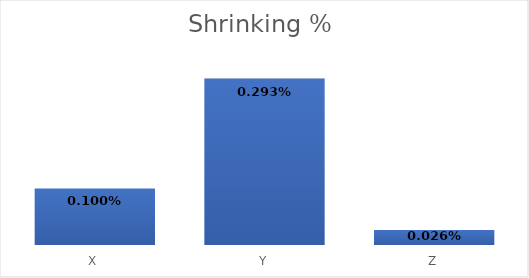
| Category | Shrinking % |
|---|---|
| X | 0.001 |
| Y | 0.003 |
| Z | 0 |